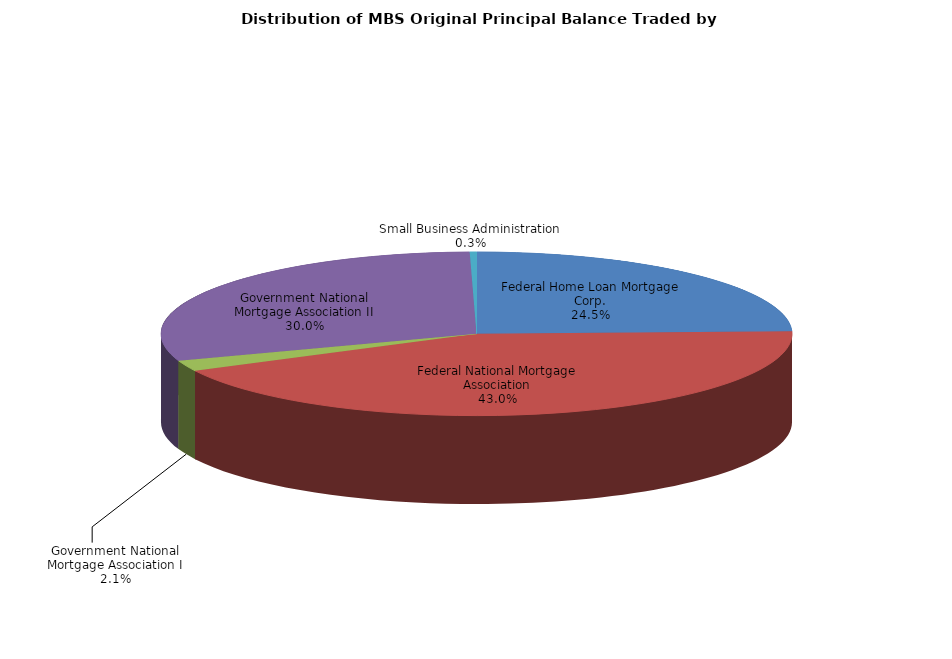
| Category | Series 0 |
|---|---|
| Federal Home Loan Mortgage Corp. | 4344826161.675 |
| Federal National Mortgage Association | 7627308477.03 |
| Government National Mortgage Association I | 378526190.085 |
| Government National Mortgage Association II | 5316438057.499 |
| Small Business Administration | 61004243.654 |